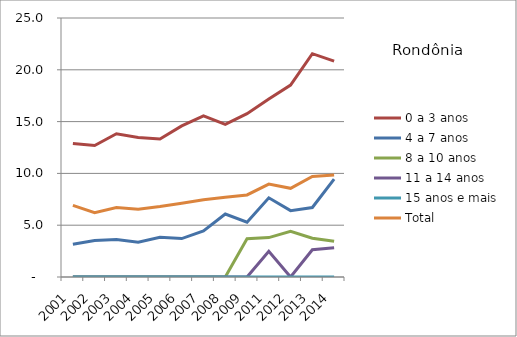
| Category | 0 a 3 anos | 4 a 7 anos | 8 a 10 anos | 11 a 14 anos | 15 anos e mais | Total |
|---|---|---|---|---|---|---|
| 2001.0 | 12.892 | 3.154 | 0 | 0 | 0 | 6.909 |
| 2002.0 | 12.692 | 3.525 | 0 | 0 | 0 | 6.214 |
| 2003.0 | 13.825 | 3.614 | 0 | 0 | 0 | 6.703 |
| 2004.0 | 13.472 | 3.346 | 0 | 0 | 0 | 6.547 |
| 2005.0 | 13.328 | 3.826 | 0 | 0 | 0 | 6.8 |
| 2006.0 | 14.58 | 3.709 | 0 | 0 | 0 | 7.112 |
| 2007.0 | 15.554 | 4.442 | 0 | 0 | 0 | 7.46 |
| 2008.0 | 14.73 | 6.083 | 0 | 0 | 0 | 7.689 |
| 2009.0 | 15.766 | 5.285 | 3.697 | 0 | 0 | 7.92 |
| 2011.0 | 17.171 | 7.645 | 3.806 | 2.485 | 0 | 8.963 |
| 2012.0 | 18.52 | 6.405 | 4.411 | 0 | 0 | 8.558 |
| 2013.0 | 21.555 | 6.707 | 3.748 | 2.63 | 0 | 9.699 |
| 2014.0 | 20.835 | 9.446 | 3.443 | 2.826 | 0 | 9.837 |